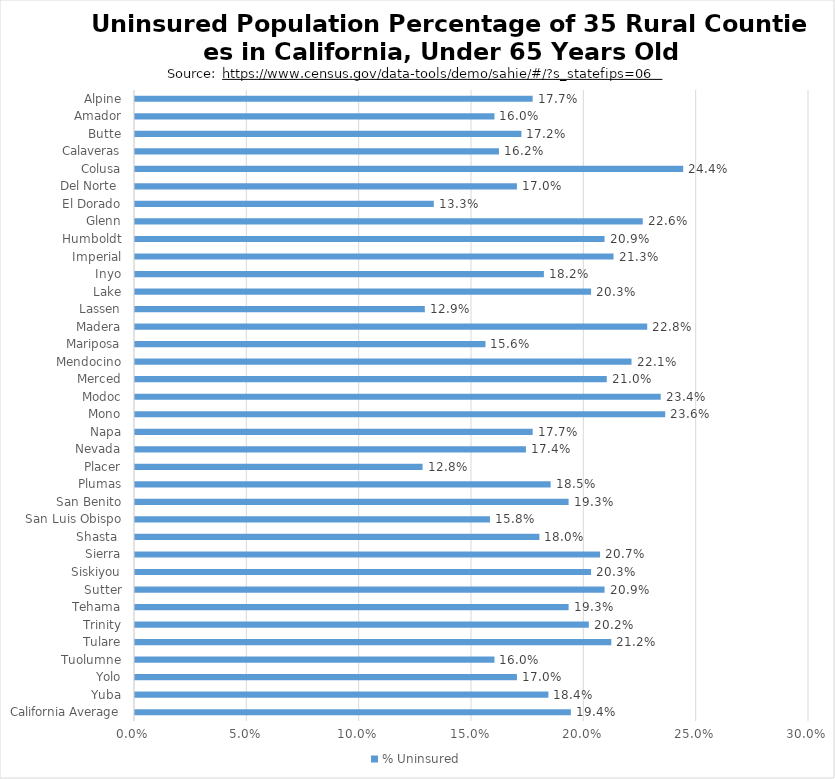
| Category | % Uninsured |
|---|---|
| California Average | 0.194 |
| Yuba | 0.184 |
| Yolo | 0.17 |
| Tuolumne | 0.16 |
| Tulare | 0.212 |
| Trinity | 0.202 |
| Tehama | 0.193 |
| Sutter | 0.209 |
| Siskiyou | 0.203 |
| Sierra | 0.207 |
| Shasta  | 0.18 |
| San Luis Obispo | 0.158 |
| San Benito | 0.193 |
| Plumas | 0.185 |
| Placer | 0.128 |
| Nevada | 0.174 |
| Napa | 0.177 |
| Mono | 0.236 |
| Modoc | 0.234 |
| Merced | 0.21 |
| Mendocino | 0.221 |
| Mariposa | 0.156 |
| Madera | 0.228 |
| Lassen | 0.129 |
| Lake | 0.203 |
| Inyo | 0.182 |
| Imperial | 0.213 |
| Humboldt | 0.209 |
| Glenn | 0.226 |
| El Dorado | 0.133 |
| Del Norte  | 0.17 |
| Colusa | 0.244 |
| Calaveras | 0.162 |
| Butte | 0.172 |
| Amador | 0.16 |
| Alpine | 0.177 |